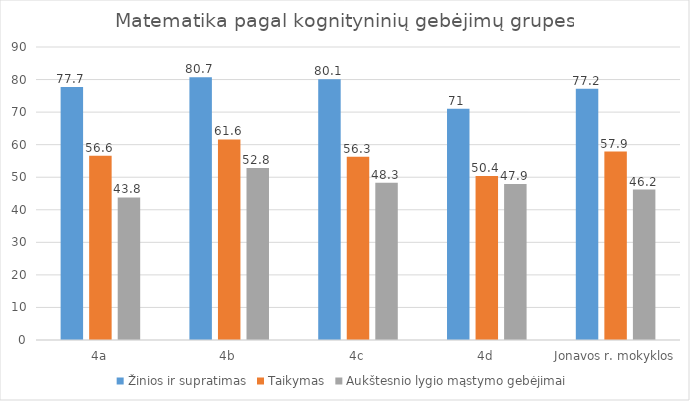
| Category | Žinios ir supratimas | Taikymas | Aukštesnio lygio mąstymo gebėjimai |
|---|---|---|---|
| 4a | 77.7 | 56.6 | 43.8 |
| 4b | 80.7 | 61.6 | 52.8 |
| 4c | 80.1 | 56.3 | 48.3 |
| 4d | 71 | 50.4 | 47.9 |
| Jonavos r. mokyklos | 77.2 | 57.9 | 46.2 |